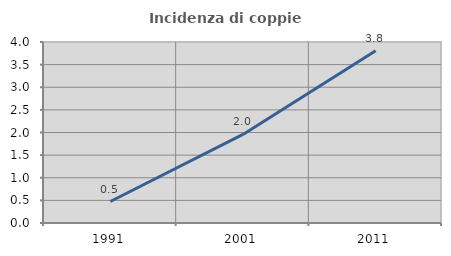
| Category | Incidenza di coppie miste |
|---|---|
| 1991.0 | 0.474 |
| 2001.0 | 1.958 |
| 2011.0 | 3.805 |